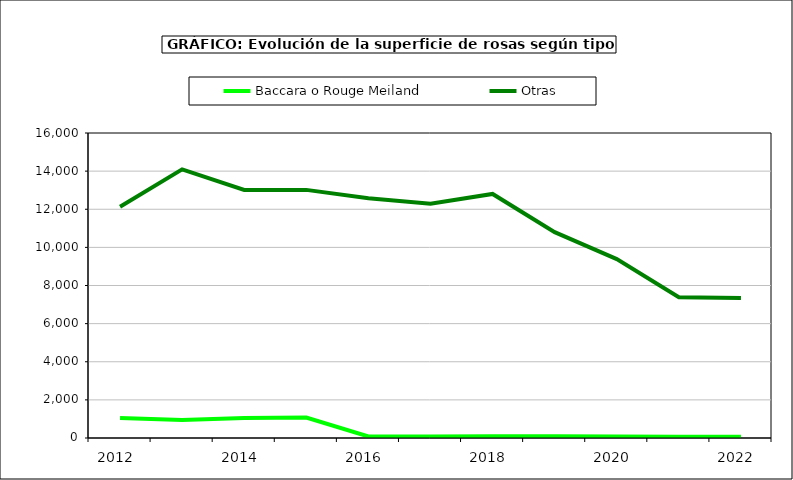
| Category | Baccara o Rouge Meiland | Otras |
|---|---|---|
| 2012.0 | 1050 | 12133 |
| 2013.0 | 950 | 14093 |
| 2014.0 | 1050 | 13013 |
| 2015.0 | 1070 | 13016 |
| 2016.0 | 79 | 12572 |
| 2017.0 | 79 | 12292 |
| 2018.0 | 93 | 12802 |
| 2019.0 | 91 | 10801 |
| 2020.0 | 74 | 9385 |
| 2021.0 | 66 | 7381 |
| 2022.0 | 68 | 7338 |